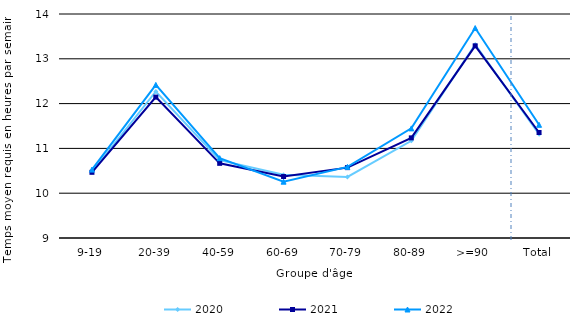
| Category | 2020 | 2021 | 2022 |
|---|---|---|---|
| 9-19 | 10.468 | 10.466 | 10.527 |
| 20-39 | 12.271 | 12.145 | 12.418 |
| 40-59 | 10.738 | 10.667 | 10.782 |
| 60-69 | 10.41 | 10.372 | 10.257 |
| 70-79 | 10.363 | 10.571 | 10.587 |
| 80-89 | 11.17 | 11.235 | 11.447 |
| >=90 | 13.317 | 13.29 | 13.687 |
| Total | 11.315 | 11.355 | 11.526 |